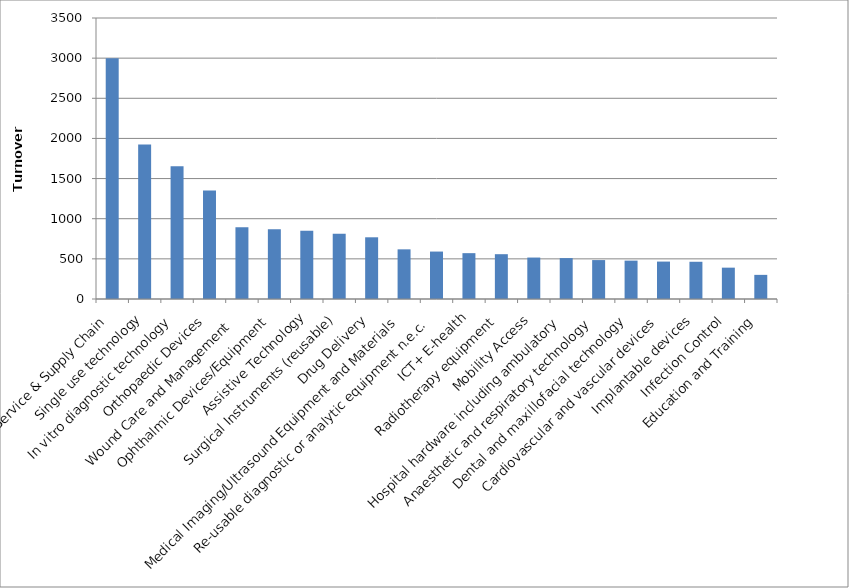
| Category | Turnover (£m) |
|---|---|
| Service & Supply Chain | 2999.925 |
| Single use technology | 1925.212 |
| In vitro diagnostic technology | 1653.843 |
| Orthopaedic Devices | 1351.111 |
| Wound Care and Management  | 893.678 |
| Ophthalmic Devices/Equipment | 867.675 |
| Assistive Technology | 849.788 |
| Surgical Instruments (reusable) | 811.67 |
| Drug Delivery | 768.575 |
| Medical Imaging/Ultrasound Equipment and Materials | 618.525 |
| Re-usable diagnostic or analytic equipment n.e.c. | 590.849 |
| ICT+ E-health | 570.973 |
| Radiotherapy equipment | 558.143 |
| Mobility Access | 516.197 |
| Hospital hardware including ambulatory | 509.546 |
| Anaesthetic and respiratory technology | 484.793 |
| Dental and maxillofacial technology | 477.911 |
| Cardiovascular and vascular devices | 466.096 |
| Implantable devices | 463.679 |
| Infection Control  | 390.322 |
| Education and Training | 300.575 |